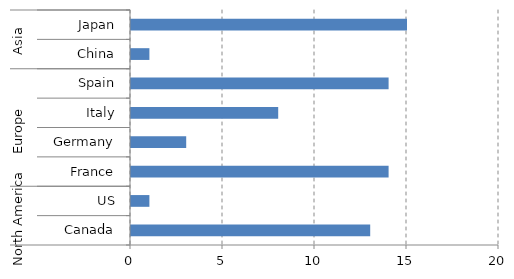
| Category | Value |
|---|---|
| 0 | 13 |
| 1 | 1 |
| 2 | 14 |
| 3 | 3 |
| 4 | 8 |
| 5 | 14 |
| 6 | 1 |
| 7 | 15 |